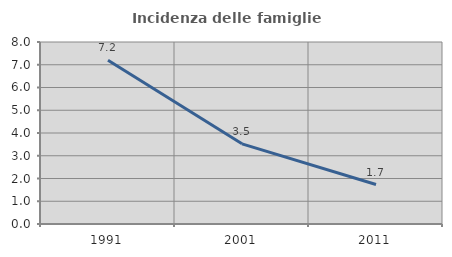
| Category | Incidenza delle famiglie numerose |
|---|---|
| 1991.0 | 7.194 |
| 2001.0 | 3.525 |
| 2011.0 | 1.734 |